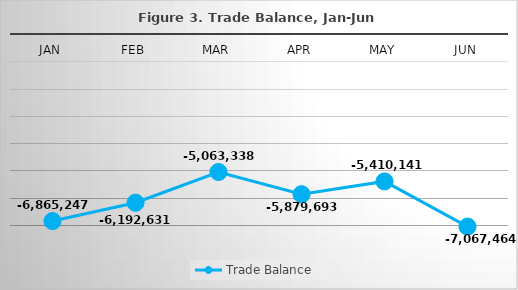
| Category | Trade Balance |
|---|---|
| Jan | -6865247.38 |
| Feb | -6192630.64 |
| Mar | -5063338.41 |
| Apr | -5879693.41 |
| May | -5410140.62 |
| Jun | -7067463.8 |